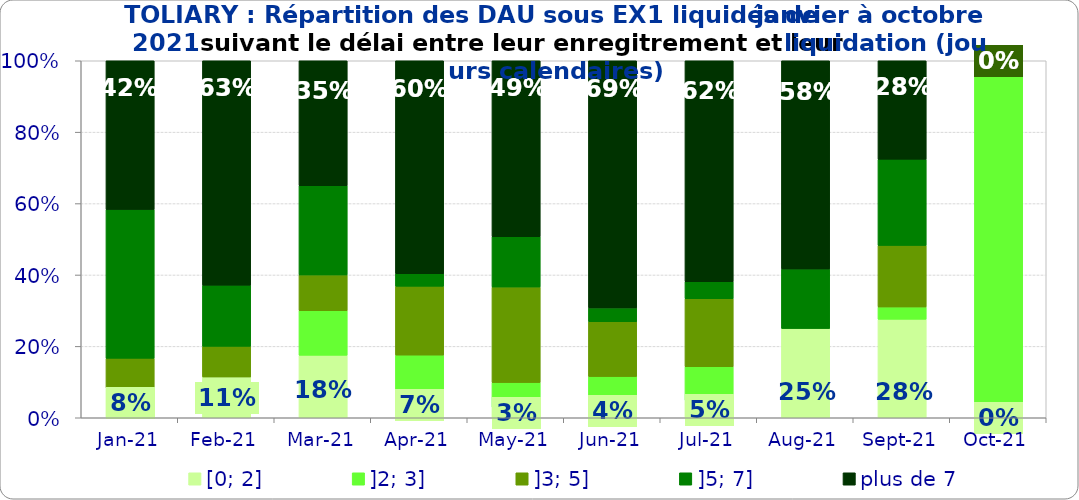
| Category | [0; 2] | ]2; 3] | ]3; 5] | ]5; 7] | plus de 7 |
|---|---|---|---|---|---|
| 2021-01-01 | 0.083 | 0 | 0.083 | 0.417 | 0.417 |
| 2021-02-01 | 0.114 | 0 | 0.086 | 0.171 | 0.629 |
| 2021-03-01 | 0.175 | 0.125 | 0.1 | 0.25 | 0.35 |
| 2021-04-01 | 0.07 | 0.105 | 0.193 | 0.035 | 0.596 |
| 2021-05-01 | 0.028 | 0.07 | 0.268 | 0.141 | 0.493 |
| 2021-06-01 | 0.038 | 0.077 | 0.154 | 0.038 | 0.692 |
| 2021-07-01 | 0.048 | 0.095 | 0.19 | 0.048 | 0.619 |
| 2021-08-01 | 0.25 | 0 | 0 | 0.167 | 0.583 |
| 2021-09-01 | 0.276 | 0.034 | 0.172 | 0.241 | 0.276 |
| 2021-10-01 | 0 | 1 | 0 | 0 | 0 |